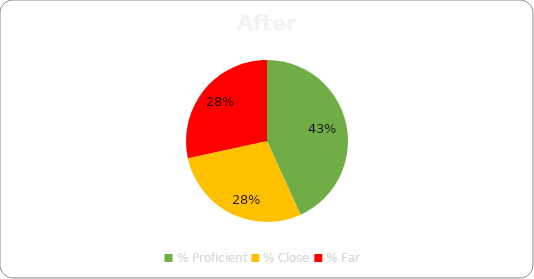
| Category | Series 0 |
|---|---|
| % Proficient | 0.432 |
| % Close | 0.284 |
| % Far | 0.284 |